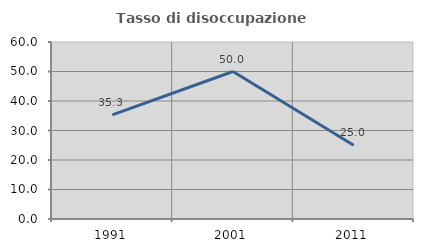
| Category | Tasso di disoccupazione giovanile  |
|---|---|
| 1991.0 | 35.294 |
| 2001.0 | 50 |
| 2011.0 | 25 |